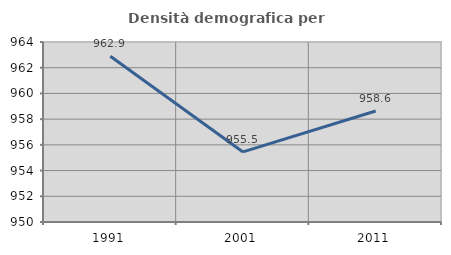
| Category | Densità demografica |
|---|---|
| 1991.0 | 962.896 |
| 2001.0 | 955.45 |
| 2011.0 | 958.637 |